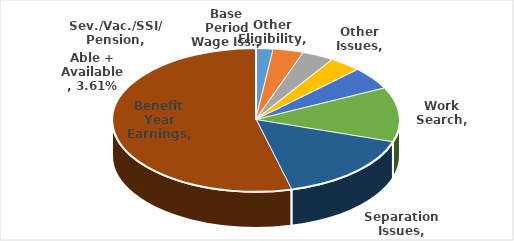
| Category | Series 0 |
|---|---|
| Other Eligibility | 0.02 |
| Sev./Vac./SSI/ Pension | 0.034 |
| Other Issues | 0.036 |
| Able + Available | 0.036 |
| Base Period Wage Iss. | 0.051 |
| Work Search | 0.123 |
| Separation Issues | 0.16 |
| Benefit Year Earnings | 0.539 |